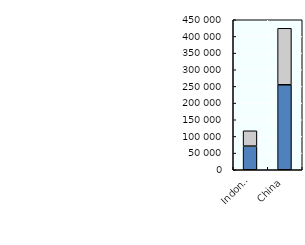
| Category | 0-14 year olds | 15-24 year olds |
|---|---|---|
| Indonesia | 70941.102 | 45971.613 |
| China | 254930.37 | 169500.027 |